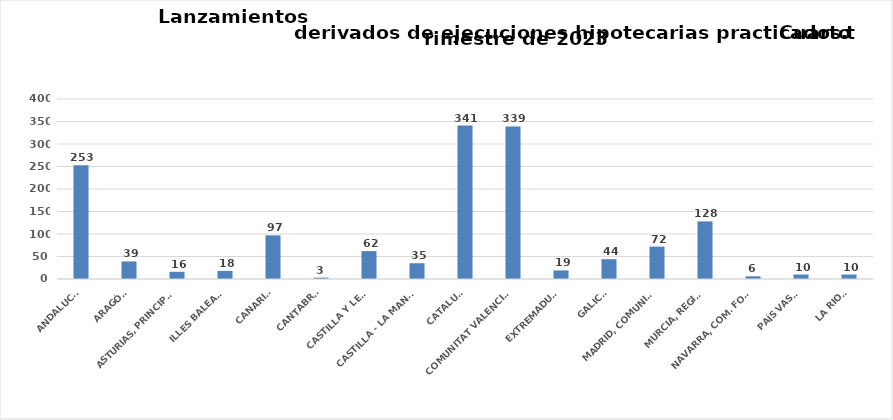
| Category | Series 0 |
|---|---|
| ANDALUCÍA | 253 |
| ARAGÓN | 39 |
| ASTURIAS, PRINCIPADO | 16 |
| ILLES BALEARS | 18 |
| CANARIAS | 97 |
| CANTABRIA | 3 |
| CASTILLA Y LEÓN | 62 |
| CASTILLA - LA MANCHA | 35 |
| CATALUÑA | 341 |
| COMUNITAT VALENCIANA | 339 |
| EXTREMADURA | 19 |
| GALICIA | 44 |
| MADRID, COMUNIDAD | 72 |
| MURCIA, REGIÓN | 128 |
| NAVARRA, COM. FORAL | 6 |
| PAÍS VASCO | 10 |
| LA RIOJA | 10 |